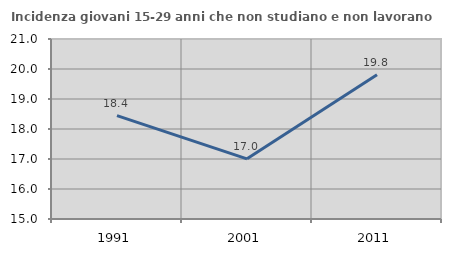
| Category | Incidenza giovani 15-29 anni che non studiano e non lavorano  |
|---|---|
| 1991.0 | 18.445 |
| 2001.0 | 17.005 |
| 2011.0 | 19.806 |